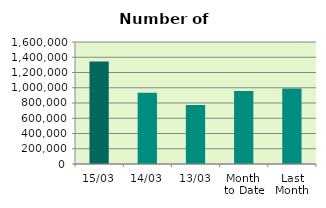
| Category | Series 0 |
|---|---|
| 15/03 | 1345192 |
| 14/03 | 933086 |
| 13/03 | 773448 |
| Month 
to Date | 955906.727 |
| Last
Month | 989849.1 |